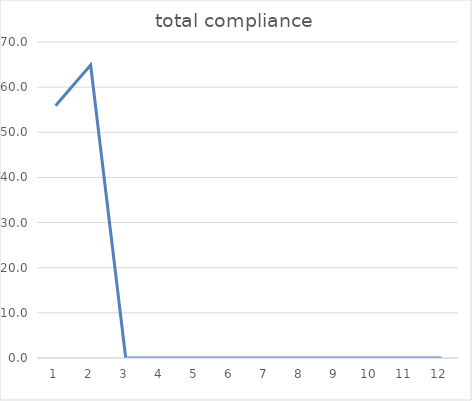
| Category | total compliance |
|---|---|
| 0 | 55.9 |
| 1 | 64.9 |
| 2 | 0 |
| 3 | 0 |
| 4 | 0 |
| 5 | 0 |
| 6 | 0 |
| 7 | 0 |
| 8 | 0 |
| 9 | 0 |
| 10 | 0 |
| 11 | 0 |